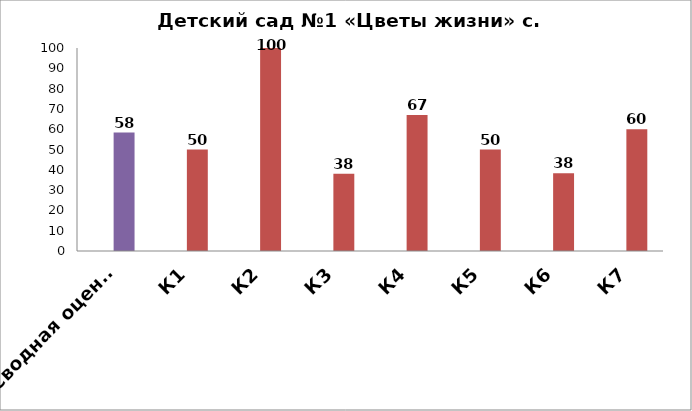
| Category | Series 0 | Детский сад №1 «Цветы жизни» с. Итум-Кали |
|---|---|---|
| Сводная оценка |  | 58.333 |
| К1 |  | 50 |
| К2 |  | 100 |
| К3 |  | 38 |
| К4 |  | 67 |
| К5 |  | 50 |
| К6 |  | 38.33 |
| К7 |  | 60 |